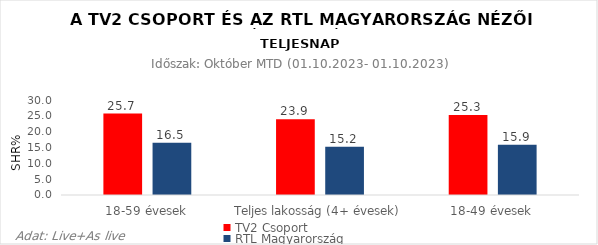
| Category | TV2 Csoport | RTL Magyarország |
|---|---|---|
| 18-59 évesek | 25.7 | 16.5 |
| Teljes lakosság (4+ évesek) | 23.9 | 15.2 |
| 18-49 évesek | 25.3 | 15.9 |